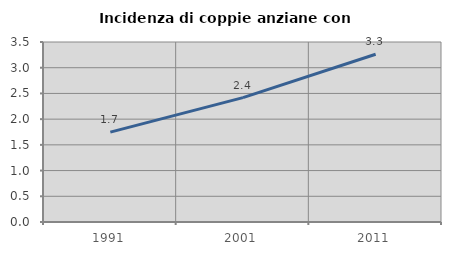
| Category | Incidenza di coppie anziane con figli |
|---|---|
| 1991.0 | 1.747 |
| 2001.0 | 2.418 |
| 2011.0 | 3.261 |